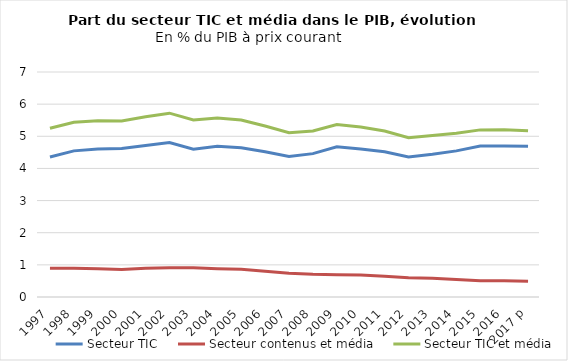
| Category | Secteur TIC | Secteur contenus et média | Secteur TIC et média |
|---|---|---|---|
| 1997 | 4.355 | 0.894 | 5.249 |
| 1998 | 4.547 | 0.891 | 5.438 |
| 1999 | 4.606 | 0.876 | 5.483 |
| 2000 | 4.62 | 0.853 | 5.474 |
| 2001 | 4.715 | 0.894 | 5.61 |
| 2002 | 4.806 | 0.913 | 5.72 |
| 2003 | 4.597 | 0.908 | 5.505 |
| 2004 | 4.692 | 0.88 | 5.572 |
| 2005 | 4.645 | 0.864 | 5.508 |
| 2006 | 4.52 | 0.798 | 5.318 |
| 2007 | 4.371 | 0.74 | 5.111 |
| 2008 | 4.46 | 0.705 | 5.165 |
| 2009 | 4.676 | 0.693 | 5.369 |
| 2010 | 4.603 | 0.686 | 5.289 |
| 2011 | 4.52 | 0.645 | 5.164 |
| 2012 | 4.356 | 0.601 | 4.957 |
| 2013 | 4.442 | 0.583 | 5.025 |
| 2014 | 4.546 | 0.548 | 5.095 |
| 2015 | 4.696 | 0.503 | 5.199 |
| 2016 | 4.697 | 0.503 | 5.2 |
| 2017 p | 4.689 | 0.487 | 5.176 |